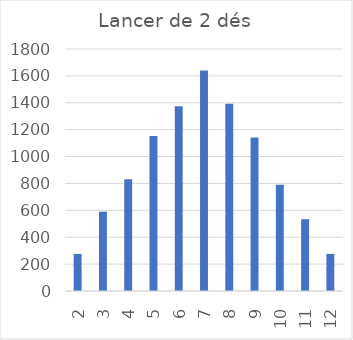
| Category | Series 0 |
|---|---|
| 2.0 | 276 |
| 3.0 | 590 |
| 4.0 | 832 |
| 5.0 | 1152 |
| 6.0 | 1374 |
| 7.0 | 1640 |
| 8.0 | 1393 |
| 9.0 | 1142 |
| 10.0 | 791 |
| 11.0 | 534 |
| 12.0 | 276 |